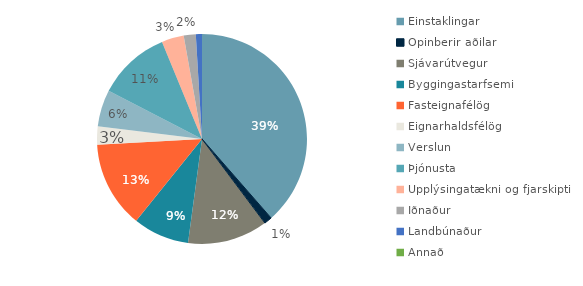
| Category | Series 0 |
|---|---|
| Einstaklingar | 356940 |
| Opinberir aðilar | 11243 |
| Sjávarútvegur | 114355 |
| Byggingastarfsemi | 80067 |
| Fasteignafélög | 123483 |
| Eignarhaldsfélög | 25943 |
| Verslun | 52363 |
| Þjónusta | 103706 |
| Upplýsingatækni og fjarskipti | 31624 |
| Iðnaður | 17185 |
| Landbúnaður | 8726 |
| Annað | 1 |